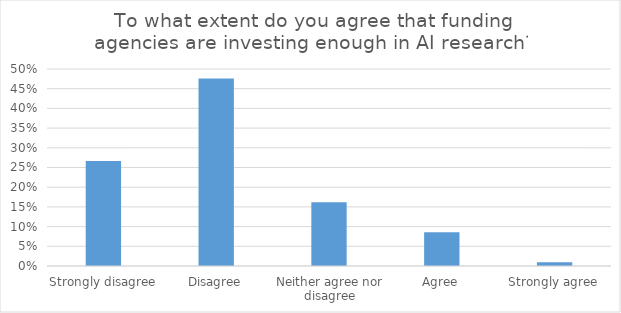
| Category | Series 0 |
|---|---|
| Strongly disagree | 0.267 |
| Disagree | 0.476 |
| Neither agree nor disagree | 0.162 |
| Agree | 0.086 |
| Strongly agree | 0.01 |